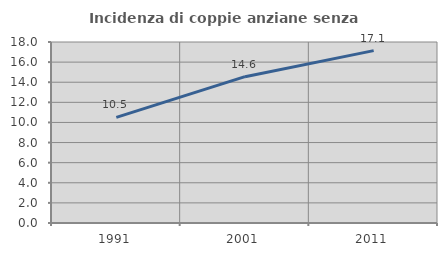
| Category | Incidenza di coppie anziane senza figli  |
|---|---|
| 1991.0 | 10.51 |
| 2001.0 | 14.551 |
| 2011.0 | 17.143 |